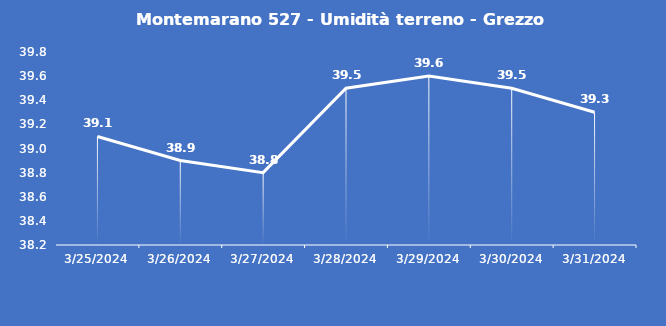
| Category | Montemarano 527 - Umidità terreno - Grezzo (%VWC) |
|---|---|
| 3/25/24 | 39.1 |
| 3/26/24 | 38.9 |
| 3/27/24 | 38.8 |
| 3/28/24 | 39.5 |
| 3/29/24 | 39.6 |
| 3/30/24 | 39.5 |
| 3/31/24 | 39.3 |